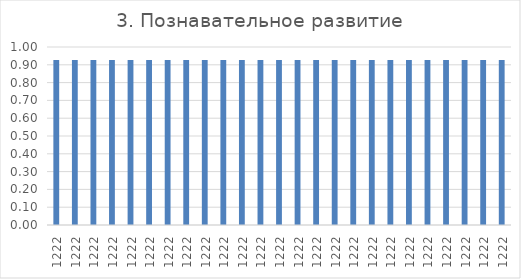
| Category | Series 0 |
|---|---|
| 1222.0 | 0.927 |
| 1222.0 | 0.927 |
| 1222.0 | 0.927 |
| 1222.0 | 0.927 |
| 1222.0 | 0.927 |
| 1222.0 | 0.927 |
| 1222.0 | 0.927 |
| 1222.0 | 0.927 |
| 1222.0 | 0.927 |
| 1222.0 | 0.927 |
| 1222.0 | 0.927 |
| 1222.0 | 0.927 |
| 1222.0 | 0.927 |
| 1222.0 | 0.927 |
| 1222.0 | 0.927 |
| 1222.0 | 0.927 |
| 1222.0 | 0.927 |
| 1222.0 | 0.927 |
| 1222.0 | 0.927 |
| 1222.0 | 0.927 |
| 1222.0 | 0.927 |
| 1222.0 | 0.927 |
| 1222.0 | 0.927 |
| 1222.0 | 0.927 |
| 1222.0 | 0.927 |